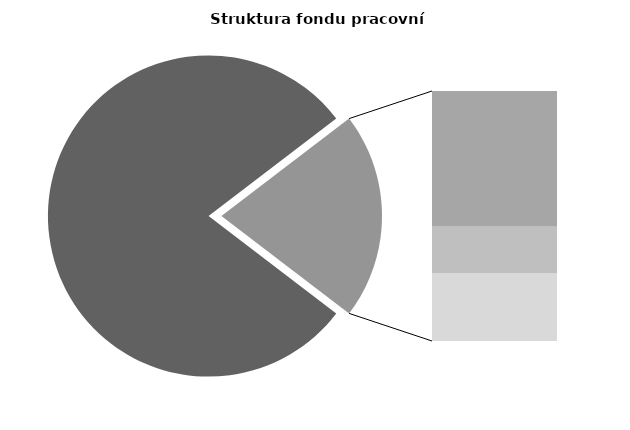
| Category | Series 0 |
|---|---|
| Průměrná měsíční odpracovaná doba bez přesčasu | 136.208 |
| Dovolená | 19.357 |
| Nemoc | 6.608 |
| Jiné | 9.69 |